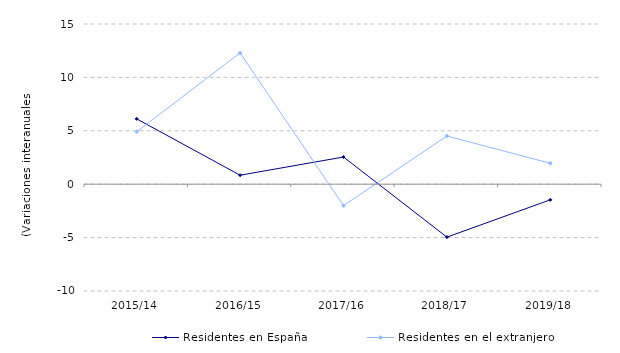
| Category | Residentes en España | Residentes en el extranjero |
|---|---|---|
| 2015/14 | 6.116 | 4.921 |
| 2016/15 | 0.842 | 12.291 |
| 2017/16 | 2.546 | -2.007 |
| 2018/17 | -4.956 | 4.513 |
| 2019/18 | -1.463 | 1.959 |